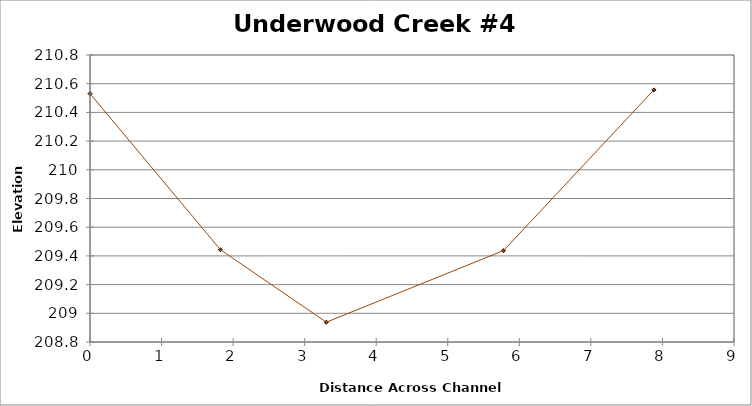
| Category | Series 0 |
|---|---|
| 0.0 | 210.531 |
| 1.8224840191859872 | 209.443 |
| 3.302962458243013 | 208.938 |
| 5.779777850489756 | 209.437 |
| 7.88100913588527 | 210.557 |